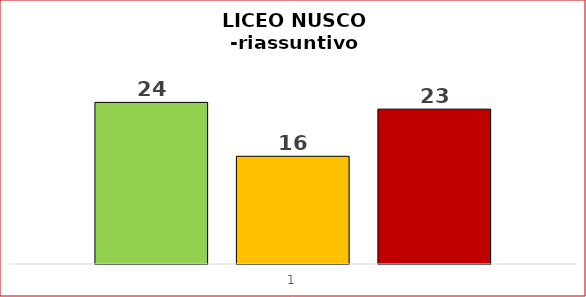
| Category | SUPERATI | PARZIAL.NTE SUPERATI | NON SUPERATI |
|---|---|---|---|
| 0 | 24 | 16 | 23 |